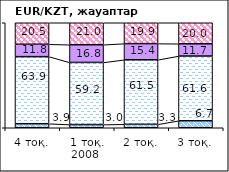
| Category | позитивно | не повлияло | негативно | не знаю |
|---|---|---|---|---|
| 4 тоқ. | 3.85 | 63.86 | 11.81 | 20.48 |
| 1 тоқ. 2008  | 3.02 | 59.19 | 16.84 | 20.95 |
| 2 тоқ. | 3.29 | 61.45 | 15.39 | 19.86 |
| 3 тоқ. | 6.68 | 61.61 | 11.67 | 20.04 |